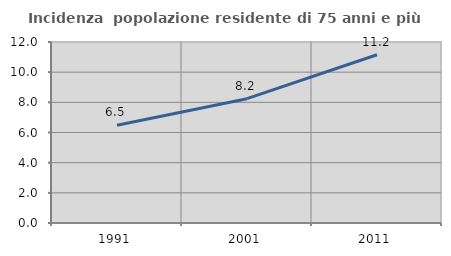
| Category | Incidenza  popolazione residente di 75 anni e più |
|---|---|
| 1991.0 | 6.486 |
| 2001.0 | 8.243 |
| 2011.0 | 11.156 |